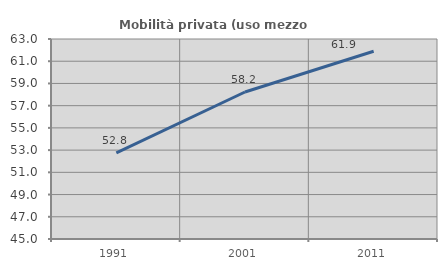
| Category | Mobilità privata (uso mezzo privato) |
|---|---|
| 1991.0 | 52.752 |
| 2001.0 | 58.231 |
| 2011.0 | 61.894 |